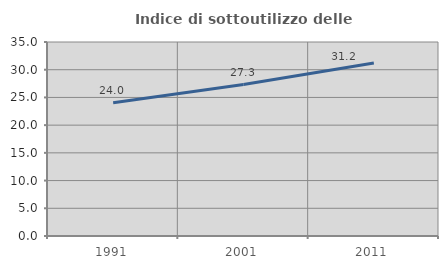
| Category | Indice di sottoutilizzo delle abitazioni  |
|---|---|
| 1991.0 | 24.048 |
| 2001.0 | 27.33 |
| 2011.0 | 31.196 |